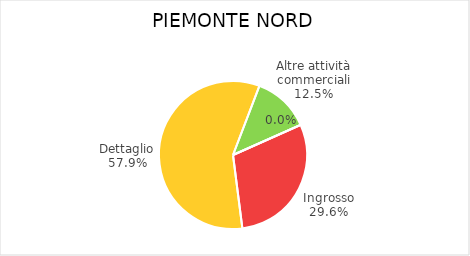
| Category | Piemonte Nord |
|---|---|
| Ingrosso | 6308 |
| Dettaglio | 12310 |
| Altre attività commerciali | 2664 |